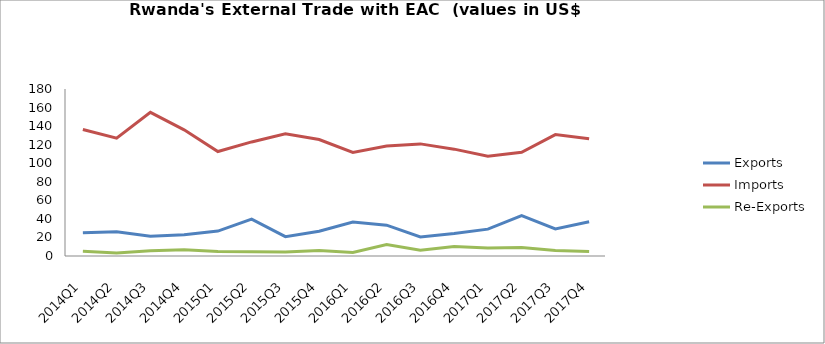
| Category | Exports | Imports | Re-Exports |
|---|---|---|---|
| 2014Q1 | 24.972 | 136.34 | 4.995 |
| 2014Q2 | 26.089 | 126.976 | 3.349 |
| 2014Q3 | 21.201 | 154.872 | 5.783 |
| 2014Q4 | 22.972 | 136.019 | 6.622 |
| 2015Q1 | 26.83 | 112.565 | 4.834 |
| 2015Q2 | 39.758 | 122.962 | 4.482 |
| 2015Q3 | 20.853 | 131.628 | 4.348 |
| 2015Q4 | 26.719 | 125.59 | 5.994 |
| 2016Q1 | 36.703 | 111.68 | 3.904 |
| 2016Q2 | 33.197 | 118.463 | 12.441 |
| 2016Q3 | 20.47 | 120.843 | 6.13 |
| 2016Q4 | 24.212 | 115.168 | 10.336 |
| 2017Q1 | 28.948 | 107.584 | 8.693 |
| 2017Q2 | 43.559 | 111.838 | 9.044 |
| 2017Q3 | 29.262 | 130.823 | 5.955 |
| 2017Q4 | 36.925 | 126.387 | 4.74 |